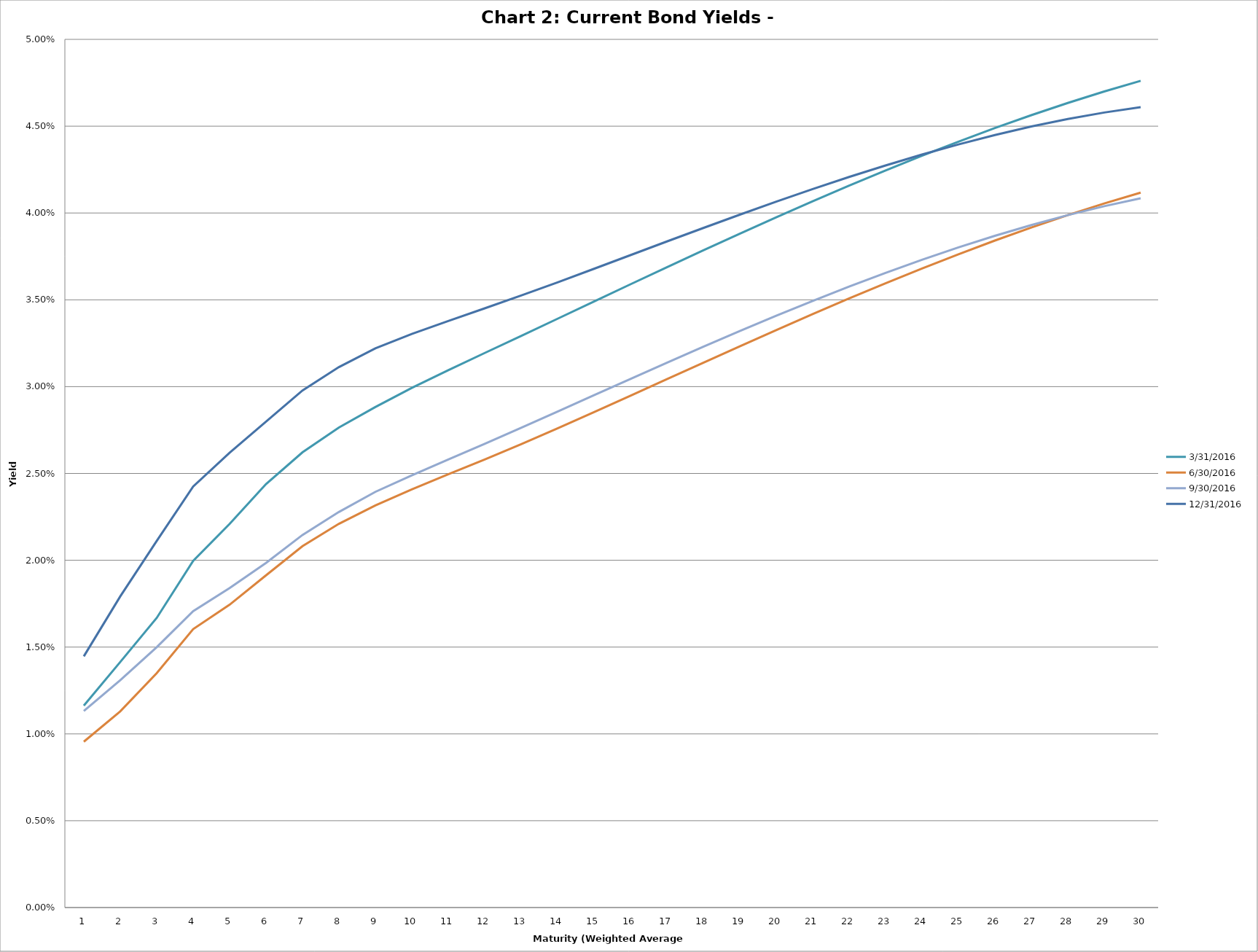
| Category | 3/31/2016 | 6/30/2016 | 9/30/2016 | 12/31/2016 |
|---|---|---|---|---|
| 0 | 0.012 | 0.01 | 0.011 | 0.014 |
| 1 | 0.014 | 0.011 | 0.013 | 0.018 |
| 2 | 0.017 | 0.013 | 0.015 | 0.021 |
| 3 | 0.02 | 0.016 | 0.017 | 0.024 |
| 4 | 0.022 | 0.017 | 0.018 | 0.026 |
| 5 | 0.024 | 0.019 | 0.02 | 0.028 |
| 6 | 0.026 | 0.021 | 0.021 | 0.03 |
| 7 | 0.028 | 0.022 | 0.023 | 0.031 |
| 8 | 0.029 | 0.023 | 0.024 | 0.032 |
| 9 | 0.03 | 0.024 | 0.025 | 0.033 |
| 10 | 0.031 | 0.025 | 0.026 | 0.034 |
| 11 | 0.032 | 0.026 | 0.027 | 0.035 |
| 12 | 0.033 | 0.027 | 0.028 | 0.035 |
| 13 | 0.034 | 0.028 | 0.029 | 0.036 |
| 14 | 0.035 | 0.029 | 0.03 | 0.037 |
| 15 | 0.036 | 0.029 | 0.03 | 0.038 |
| 16 | 0.037 | 0.03 | 0.031 | 0.038 |
| 17 | 0.038 | 0.031 | 0.032 | 0.039 |
| 18 | 0.039 | 0.032 | 0.033 | 0.04 |
| 19 | 0.04 | 0.033 | 0.034 | 0.041 |
| 20 | 0.041 | 0.034 | 0.035 | 0.041 |
| 21 | 0.042 | 0.035 | 0.036 | 0.042 |
| 22 | 0.042 | 0.036 | 0.037 | 0.043 |
| 23 | 0.043 | 0.037 | 0.037 | 0.043 |
| 24 | 0.044 | 0.038 | 0.038 | 0.044 |
| 25 | 0.045 | 0.038 | 0.039 | 0.044 |
| 26 | 0.046 | 0.039 | 0.039 | 0.045 |
| 27 | 0.046 | 0.04 | 0.04 | 0.045 |
| 28 | 0.047 | 0.041 | 0.04 | 0.046 |
| 29 | 0.048 | 0.041 | 0.041 | 0.046 |